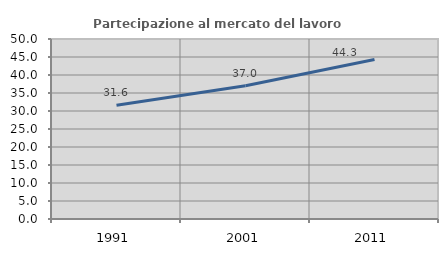
| Category | Partecipazione al mercato del lavoro  femminile |
|---|---|
| 1991.0 | 31.604 |
| 2001.0 | 37.027 |
| 2011.0 | 44.316 |